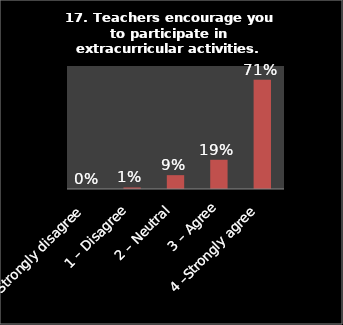
| Category | Series 0 |
|---|---|
| 0 – Strongly disagree | 0 |
| 1 – Disagree | 0.01 |
| 2 – Neutral | 0.09 |
| 3 – Agree | 0.19 |
| 4 –Strongly agree | 0.71 |